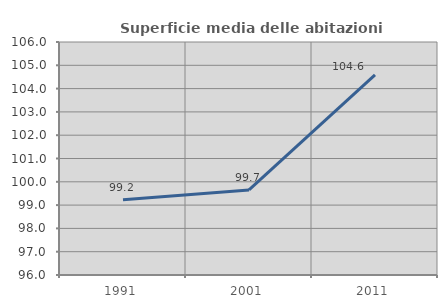
| Category | Superficie media delle abitazioni occupate |
|---|---|
| 1991.0 | 99.23 |
| 2001.0 | 99.651 |
| 2011.0 | 104.588 |